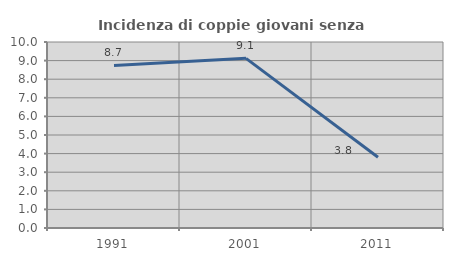
| Category | Incidenza di coppie giovani senza figli |
|---|---|
| 1991.0 | 8.741 |
| 2001.0 | 9.121 |
| 2011.0 | 3.806 |